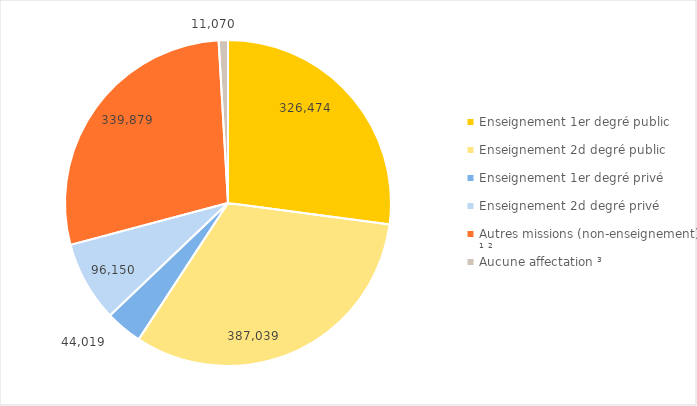
| Category | Series 0 |
|---|---|
| Enseignement 1er degré public  | 326474 |
| Enseignement 2d degré public  | 387039 |
| Enseignement 1er degré privé | 44019 |
| Enseignement 2d degré privé  | 96150 |
| Autres missions (non-enseignement) ¹ ² | 339879 |
| Aucune affectation ³ | 11070 |